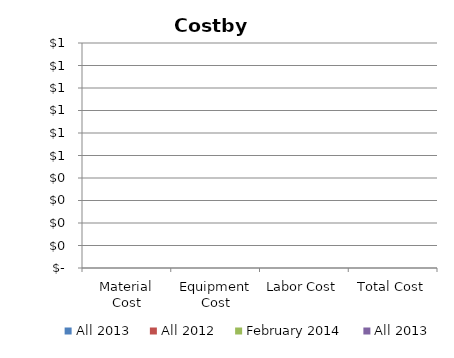
| Category | All 2013 | All 2012 | February 2014 |
|---|---|---|---|
| Material Cost | 0 | 0 | 0 |
| Equipment Cost | 0 | 0 | 0 |
| Labor Cost | 0 | 0 | 0 |
| Total Cost | 0 | 0 | 0 |